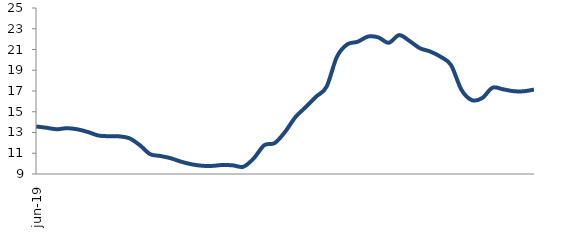
| Category | Series 0 |
|---|---|
| 2019-06-01 | 13.582 |
| 2019-07-01 | 13.459 |
| 2019-08-01 | 13.315 |
| 2019-09-01 | 13.417 |
| 2019-10-01 | 13.304 |
| 2019-11-01 | 13.05 |
| 2019-12-01 | 12.71 |
| 2020-01-01 | 12.642 |
| 2020-02-01 | 12.627 |
| 2020-03-01 | 12.445 |
| 2020-04-01 | 11.784 |
| 2020-05-01 | 10.914 |
| 2020-06-01 | 10.736 |
| 2020-07-01 | 10.514 |
| 2020-08-01 | 10.182 |
| 2020-09-01 | 9.933 |
| 2020-10-01 | 9.795 |
| 2020-11-01 | 9.783 |
| 2020-12-01 | 9.869 |
| 2021-01-01 | 9.83 |
| 2021-02-01 | 9.703 |
| 2021-03-01 | 10.521 |
| 2021-04-01 | 11.773 |
| 2021-05-01 | 11.98 |
| 2021-06-01 | 13.052 |
| 2021-07-01 | 14.478 |
| 2021-08-01 | 15.452 |
| 2021-09-01 | 16.459 |
| 2021-10-01 | 17.401 |
| 2021-11-01 | 20.289 |
| 2021-12-01 | 21.495 |
| 2022-01-01 | 21.744 |
| 2022-02-01 | 22.249 |
| 2022-03-01 | 22.164 |
| 2022-04-01 | 21.65 |
| 2022-05-01 | 22.386 |
| 2022-06-01 | 21.821 |
| 2022-07-01 | 21.126 |
| 2022-08-01 | 20.803 |
| 2022-09-01 | 20.298 |
| 2022-10-01 | 19.505 |
| 2022-11-01 | 17.131 |
| 2022-12-01 | 16.123 |
| 2023-01-01 | 16.316 |
| 2023-02-01 | 17.317 |
| 2023-03-01 | 17.168 |
| 2023-04-01 | 16.986 |
| 2023-05-01 | 16.972 |
| 2023-06-01 | 17.138 |